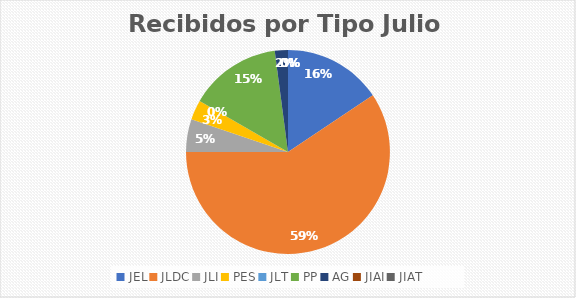
| Category | Series 0 |
|---|---|
| JEL | 15 |
| JLDC | 57 |
| JLI | 5 |
| PES | 3 |
| JLT | 0 |
| PP | 14 |
| AG | 2 |
| JIAI | 0 |
| JIAT | 0 |